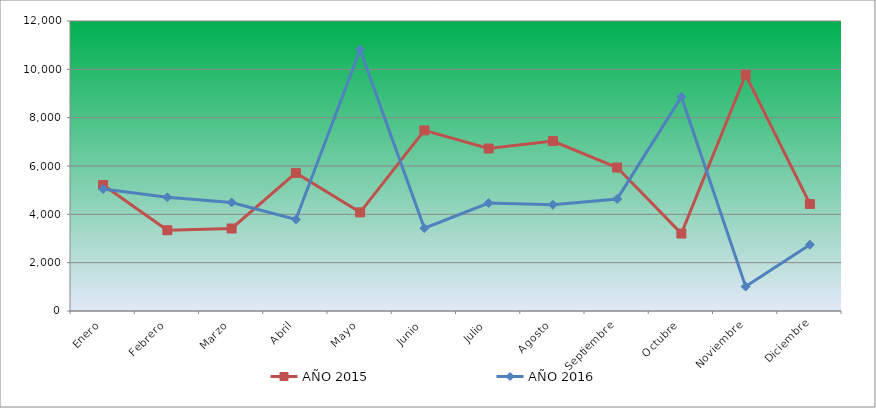
| Category | AÑO 2015 | AÑO 2016 |
|---|---|---|
| Enero | 5213.81 | 5048.989 |
| Febrero | 3341.98 | 4702.802 |
| Marzo | 3414.282 | 4492.69 |
| Abril | 5713.64 | 3789.112 |
| Mayo | 4081.072 | 10811.321 |
| Junio | 7473.98 | 3426.719 |
| Julio | 6725.188 | 4469.644 |
| Agosto | 7029.405 | 4397.761 |
| Septiembre | 5935.786 | 4631.354 |
| Octubre | 3205.409 | 8861.762 |
| Noviembre | 9773.362 | 1013.056 |
| Diciembre | 4430.137 | 2740.748 |